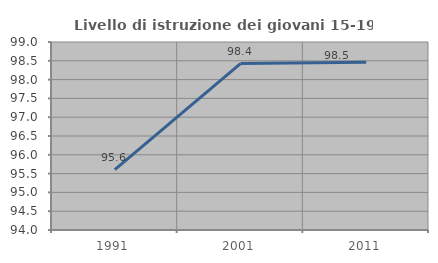
| Category | Livello di istruzione dei giovani 15-19 anni |
|---|---|
| 1991.0 | 95.607 |
| 2001.0 | 98.427 |
| 2011.0 | 98.464 |